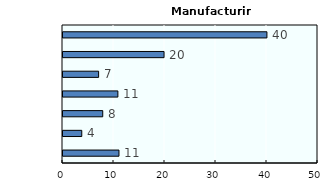
| Category | Manufacturing |
|---|---|
| Chamber of commerce | 10.976 |
| Female group | 3.682 |
| Group similar jobs | 7.792 |
| Industry group | 10.762 |
| Other | 6.985 |
| SME group | 19.815 |
| None | 39.988 |